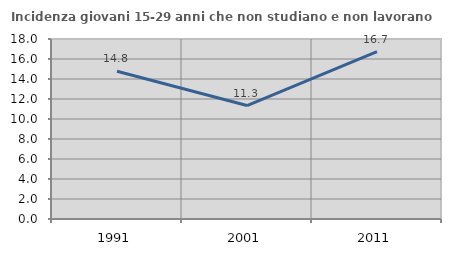
| Category | Incidenza giovani 15-29 anni che non studiano e non lavorano  |
|---|---|
| 1991.0 | 14.768 |
| 2001.0 | 11.347 |
| 2011.0 | 16.73 |